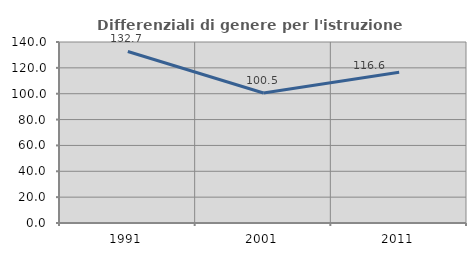
| Category | Differenziali di genere per l'istruzione superiore |
|---|---|
| 1991.0 | 132.659 |
| 2001.0 | 100.518 |
| 2011.0 | 116.562 |